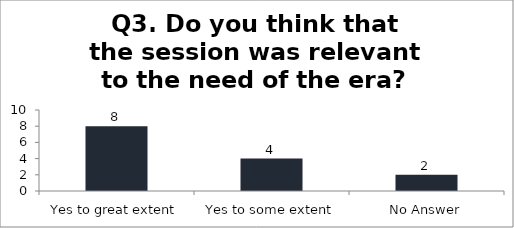
| Category | Q3. Do you think that the session was relevant to the need of the era? |
|---|---|
| Yes to great extent | 8 |
| Yes to some extent | 4 |
| No Answer | 2 |